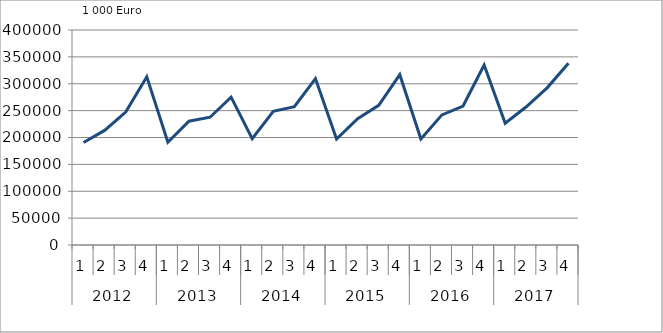
| Category | Ausbaugewerblicher Umsatz3 |
|---|---|
| 0 | 190755 |
| 1 | 213167 |
| 2 | 247277 |
| 3 | 312946 |
| 4 | 191088.978 |
| 5 | 230353.875 |
| 6 | 237735.574 |
| 7 | 275098.219 |
| 8 | 197732.754 |
| 9 | 248690.349 |
| 10 | 257339.084 |
| 11 | 309632.186 |
| 12 | 197030.42 |
| 13 | 235094.994 |
| 14 | 259758.438 |
| 15 | 316833.232 |
| 16 | 197219.532 |
| 17 | 242069.899 |
| 18 | 258547.84 |
| 19 | 334764.305 |
| 20 | 226552.317 |
| 21 | 257191.13 |
| 22 | 292853.372 |
| 23 | 338154.691 |